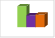
| Category | област Добрич |
|---|---|
| летен сезон 2019  | 1992347 |
| летен сезон 2021  | 1120898 |
| летен сезон 2022 г.  | 1202586 |